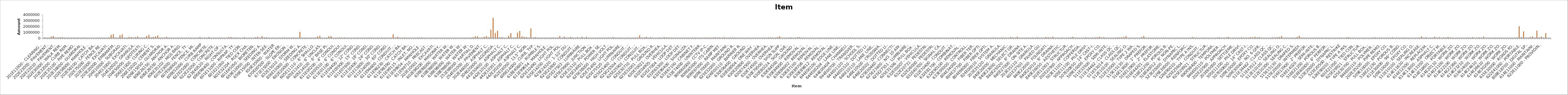
| Category | Series 0 | Series 1 |
|---|---|---|
| 201E11000 - CLEARING AND GRUBBING | 0 | 50000 |
| 202E20010 - HEADWALL REMOVED | 0 | 418.27 |
| 202E20010 - HEADWALL REMOVED | 0 | 836.54 |
| 202E23000 - PAVEMENT REMOVED | 0 | 198575.1 |
| 202E23000 - PAVEMENT REMOVED | 0 | 269966.1 |
| 202E23010 - PAVEMENT REMOVED, ASPHALT | 0 | 33501.96 |
| 202E23010 - PAVEMENT REMOVED, ASPHALT | 0 | 35130.6 |
| 202E23500 - WEARING COURSE REMOVED | 0 | 71818.75 |
| 202E23500 - WEARING COURSE REMOVED | 0 | 87736.25 |
| 202E30000 - WALK REMOVED | 0 | 20406.6 |
| 202E30700 - CONCRETE BARRIER REMOVED | 0 | 3377.84 |
| 202E30700 - CONCRETE BARRIER REMOVED | 0 | 6952.45 |
| 202E32000 - CURB REMOVED | 0 | 11618.63 |
| 202E32500 - CURB AND GUTTER REMOVED | 0 | 9683.64 |
| 202E35100 - PIPE REMOVED, 24" AND UNDER | 0 | 5894.59 |
| 202E35100 - PIPE REMOVED, 24" AND UNDER | 0 | 19631.56 |
| 202E35200 - PIPE REMOVED, OVER 24" | 0 | 788.62 |
| 202E35200 - PIPE REMOVED, OVER 24" | 0 | 998.92 |
| 202E38000 - GUARDRAIL REMOVED | 0 | 6898.7 |
| 202E38000 - GUARDRAIL REMOVED | 0 | 8944.16 |
| 202E53100 - MAILBOX REMOVED | 0 | 196.03 |
| 202E58000 - MANHOLE REMOVED | 0 | 760.56 |
| 202E58000 - MANHOLE REMOVED | 0 | 1521.11 |
| 202E58100 - CATCH BASIN REMOVED | 0 | 796.63 |
| 202E58100 - CATCH BASIN REMOVED | 0 | 10754.46 |
| 202E58500 - CATCH BASIN ABANDONED | 0 | 1233.85 |
| 202E70000 - FILL AND PLUG EXISTING CONDUIT | 0 | 9583.86 |
| 202E75000 - FENCE REMOVED | 0 | 1722.51 |
| 202E75000 - FENCE REMOVED | 0 | 5688.13 |
| 203E10000 - EXCAVATION | 0 | 41220.07 |
| 203E10000 - EXCAVATION | 0 | 469265.36 |
| 203E10000 - EXCAVATION | 0 | 586963.02 |
| 203E10001 - EXCAVATION, AS PER PLAN | 0 | 24300 |
| 203E20000 - EMBANKMENT | 0 | 1723.3 |
| 203E20000 - EMBANKMENT | 0 | 406497.27 |
| 203E20000 - EMBANKMENT | 0 | 571971.26 |
| 204E10000 - SUBGRADE COMPACTION | 0 | 894.33 |
| 204E10000 - SUBGRADE COMPACTION | 0 | 11414.47 |
| 204E13000 - EXCAVATION OF SUBGRADE | 0 | 104940 |
| 204E13000 - EXCAVATION OF SUBGRADE | 0 | 110040 |
| 204E20001 - EMBANKMENT, AS PER PLAN | 0 | 40210 |
| 204E20001 - EMBANKMENT, AS PER PLAN | 0 | 98450 |
| 204E30020 - GRANULAR MATERIAL, TYPE C | 0 | 193722.2 |
| 204E45000 - PROOF ROLLING | 0 | 7820 |
| 204E45000 - PROOF ROLLING | 0 | 9660 |
| 204E50000 - GEOTEXTILE FABRIC | 0 | 29898 |
| 206E10500 - CEMENT | 0 | 283761.32 |
| 206E10500 - CEMENT | 0 | 463843.11 |
| 206E11000 - CURING COAT | 0 | 73481.98 |
| 206E11000 - CURING COAT | 0 | 120139.74 |
| 206E15020 - CEMENT STABILIZED SUBGRADE, 14 INCHES DEEP | 0 | 225295.6 |
| 206E15020 - CEMENT STABILIZED SUBGRADE, 14 INCHES DEEP | 0 | 369698.02 |
| 206E30000 - MIXTURE DESIGN FOR CHEMICALLY STABILIZED SOILS | 0 | 15000 |
| 206E30000 - MIXTURE DESIGN FOR CHEMICALLY STABILIZED SOILS | 0 | 15000 |
| 606E15050 - GUARDRAIL, TYPE MGS | 0 | 41192.62 |
| 606E15050 - GUARDRAIL, TYPE MGS | 0 | 135898.87 |
| 606E26050 - ANCHOR ASSEMBLY, MGS TYPE B | 0 | 16466.83 |
| 606E26150 - ANCHOR ASSEMBLY, MGS TYPE E | 0 | 8508.33 |
| 606E26150 - ANCHOR ASSEMBLY, MGS TYPE E | 0 | 14889.58 |
| 606E26550 - ANCHOR ASSEMBLY, MGS TYPE T | 0 | 3362.62 |
| 606E26550 - ANCHOR ASSEMBLY, MGS TYPE T | 0 | 10087.85 |
| 606E35002 - MGS BRIDGE TERMINAL ASSEMBLY, TYPE 1 | 0 | 4238.91 |
| 606E35002 - MGS BRIDGE TERMINAL ASSEMBLY, TYPE 1 | 0 | 8477.82 |
| 606E35102 - MGS BRIDGE TERMINAL ASSEMBLY, TYPE 2 | 0 | 1362.58 |
| 606E60040 - IMPACT ATTENUATOR, TYPE 3 UNIDIRECTIONAL | 0 | 33295.15 |
| 607E23000 - FENCE, TYPE CLT | 0 | 8194.94 |
| 607E23000 - FENCE, TYPE CLT | 0 | 28455.16 |
| 607E70000 - FENCELINE SEEDING AND MULCHING | 0 | 292.86 |
| 607E70000 - FENCELINE SEEDING AND MULCHING | 0 | 1016.9 |
| 607E98000 - FENCE, MISC.: | 0 | 12000 |
| 608E10000 - 4" CONCRETE WALK | 0 | 95280.73 |
| 608E15000 - 8" CONCRETE WALK | 0 | 3407.34 |
| 608E52000 - CURB RAMP | 0 | 15642.48 |
| 622E10140 - CONCRETE BARRIER, SINGLE SLOPE, TYPE C1 | 0 | 8672.05 |
| 622E10160 - CONCRETE BARRIER, SINGLE SLOPE, TYPE D | 0 | 102176.91 |
| 622E25000 - CONCRETE BARRIER END SECTION, TYPE D | 0 | 2762.52 |
| 622E25001 - CONCRETE BARRIER END SECTION, TYPE D, AS PER PLAN | 0 | 12600 |
| 622E25014 - CONCRETE BARRIER, END ANCHORAGE, REINFORCED, TYPE C1 | 0 | 6339.98 |
| 622E25050 - CONCRETE BARRIER, END ANCHORAGE, REINFORCED, TYPE D | 0 | 12815.04 |
| 622E25051 - CONCRETE BARRIER, END ANCHORAGE, REINFORCED, TYPE D, AS PER PLAN | 0 | 19500 |
| 623E38500 - MONUMENT ASSEMBLY | 0 | 3377.37 |
| 623E40520 - RIGHT-OF-WAY MONUMENT | 0 | 1347.86 |
| 690E98000 - BOLLARD REMOVED AND RESET | 0 | 900 |
| 690E98400 - CONSULTANT FOR CONCRETE QUALITY CONTROL INCLUDING TESTING AND INSPECTION | 0 | 100000 |
| 690E98400 - CONSULTANT FOR CONCRETE QUALITY CONTROL INCLUDING TESTING AND INSPECTION | 0 | 100000 |
| 878E25000 - INSPECTION AND COMPACTION TESTING OF UNBOUND MATERIALS | 0 | 25000 |
| 878E25000 - INSPECTION AND COMPACTION TESTING OF UNBOUND MATERIALS | 0 | 25000 |
| 601E11000 - RIPRAP, TYPE D | 0 | 1289.12 |
| 601E21050 - TIED CONCRETE BLOCK MAT, TYPE 1 | 0 | 1280.84 |
| 601E21050 - TIED CONCRETE BLOCK MAT, TYPE 1 | 0 | 1793.18 |
| 601E21050 - TIED CONCRETE BLOCK MAT, TYPE 1 | 0 | 84535.73 |
| 601E32004 - ROCK CHANNEL PROTECTION, TYPE A WITH GEOTEXTILE FABRIC | 0 | 569.63 |
| 601E32104 - ROCK CHANNEL PROTECTION, TYPE B WITH GEOTEXTILE FABRIC | 0 | 2831.64 |
| 601E32204 - ROCK CHANNEL PROTECTION, TYPE C WITH GEOTEXTILE FABRIC | 0 | 336.71 |
| 601E32204 - ROCK CHANNEL PROTECTION, TYPE C WITH GEOTEXTILE FABRIC | 0 | 3367.07 |
| 601E39000 - PAVED GUTTER, TYPE 4 | 0 | 73170 |
| 601E45050 - BIORETENTION CELL | 0 | 124852 |
| 659E00100 - SOIL ANALYSIS TEST | 0 | 580 |
| 659E00300 - TOPSOIL | 0 | 255510 |
| 659E10000 - SEEDING AND MULCHING | 0 | 48468.75 |
| 659E10000 - SEEDING AND MULCHING | 0 | 72776 |
| 659E14000 - REPAIR SEEDING AND MULCHING | 0 | 6613.8 |
| 659E15000 - INTER-SEEDING | 0 | 2865.98 |
| 659E20000 - COMMERCIAL FERTILIZER | 0 | 14140.4 |
| 659E31000 - LIME | 0 | 2277.5 |
| 659E35000 - WATER | 0 | 1953.6 |
| 659E40000 - MOWING | 0 | 998.02 |
| 659E98000 - SEEDING, MISC.: | 0 | 20100 |
| 670E00500 - SLOPE EROSION PROTECTION | 0 | 47691.98 |
| 670E00700 - DITCH EROSION PROTECTION | 0 | 1707.4 |
| 670E00700 - DITCH EROSION PROTECTION | 0 | 6049.53 |
| 671E15000 - EROSION CONTROL MAT, TYPE A | 0 | 16732.25 |
| 832E15000 - STORM WATER POLLUTION PREVENTION PLAN | 0 | 50000 |
| 832E15002 - STORM WATER POLLUTION PREVENTION INSPECTIONS | 0 | 17000 |
| 832E15010 - STORM WATER POLLUTION PREVENTION INSPECTION SOFTWARE | 0 | 9800 |
| 832E30000 - EROSION CONTROL | 0 | 991071 |
| 836E10000 - SEEDING AND EROSION CONTROL WITH TURF REINFORCING MAT, TYPE 1 | 0 | 1363.43 |
| 836E10000 - SEEDING AND EROSION CONTROL WITH TURF REINFORCING MAT, TYPE 1 | 0 | 7670.21 |
| 836E10020 - SEEDING AND EROSION CONTROL WITH TURF REINFORCING MAT, TYPE 2 | 0 | 761.81 |
| 836E10020 - SEEDING AND EROSION CONTROL WITH TURF REINFORCING MAT, TYPE 2 | 0 | 1744.54 |
| 602E20000 - CONCRETE MASONRY | 0 | 1361.78 |
| 602E20000 - CONCRETE MASONRY | 0 | 8585.16 |
| 602E98200 - MASONRY, MISC.: | 0 | 11520 |
| 605E11110 - 6" SHALLOW PIPE UNDERDRAINS WITH GEOTEXTILE FABRIC | 0 | 218770.79 |
| 605E11110 - 6" SHALLOW PIPE UNDERDRAINS WITH GEOTEXTILE FABRIC | 0 | 320993.34 |
| 605E13300 - 6" UNCLASSIFIED PIPE UNDERDRAINS | 0 | 1411.91 |
| 605E13410 - 6" UNCLASSIFIED PIPE UNDERDRAINS WITH GEOTEXTILE FABRIC | 0 | 575.73 |
| 605E13410 - 6" UNCLASSIFIED PIPE UNDERDRAINS WITH GEOTEXTILE FABRIC | 0 | 4514.23 |
| 605E14020 - 6" BASE PIPE UNDERDRAINS WITH GEOTEXTILE FABRIC | 0 | 230260.13 |
| 605E14020 - 6" BASE PIPE UNDERDRAINS WITH GEOTEXTILE FABRIC | 0 | 269134.09 |
| 611E00100 - 4" CONDUIT, TYPE B | 0 | 1819.98 |
| 611E00200 - 4" CONDUIT, TYPE C | 0 | 1850 |
| 611E00200 - 4" CONDUIT, TYPE C | 0 | 11599.5 |
| 611E00200 - 4" CONDUIT, TYPE C | 0 | 50116.5 |
| 611E00510 - 6" CONDUIT, TYPE F FOR UNDERDRAIN OUTLETS | 0 | 26657 |
| 611E00510 - 6" CONDUIT, TYPE F FOR UNDERDRAIN OUTLETS | 0 | 48348.78 |
| 611E00900 - 6" CONDUIT, TYPE B | 0 | 425.46 |
| 611E00900 - 6" CONDUIT, TYPE B | 0 | 2080.01 |
| 611E01100 - 6" CONDUIT, TYPE C | 0 | 1930.24 |
| 611E01500 - 6" CONDUIT, TYPE F | 0 | 2137.4 |
| 611E04400 - 12" CONDUIT, TYPE B | 0 | 4117.87 |
| 611E04400 - 12" CONDUIT, TYPE B | 0 | 27270.42 |
| 611E04600 - 12" CONDUIT, TYPE C | 0 | 1534.48 |
| 611E05900 - 15" CONDUIT, TYPE B | 0 | 7409.91 |
| 611E05900 - 15" CONDUIT, TYPE B | 0 | 9864.46 |
| 611E07400 - 18" CONDUIT, TYPE B | 0 | 9611.81 |
| 611E07400 - 18" CONDUIT, TYPE B | 0 | 28617.66 |
| 611E07600 - 18" CONDUIT, TYPE C | 0 | 29315.43 |
| 611E08900 - 21" CONDUIT, TYPE B | 0 | 2393.61 |
| 611E10400 - 24" CONDUIT, TYPE B | 0 | 8345.94 |
| 611E10400 - 24" CONDUIT, TYPE B | 0 | 11291.63 |
| 611E12100 - 27" CONDUIT, TYPE C | 0 | 1714.72 |
| 611E13400 - 30" CONDUIT, TYPE B | 0 | 7181 |
| 611E13600 - 30" CONDUIT, TYPE C | 0 | 1476.21 |
| 611E13600 - 30" CONDUIT, TYPE C | 0 | 5461.96 |
| 611E16600 - 36" CONDUIT, TYPE C  | 0 | 3044.08 |
| 611E24000 - 60" CONDUIT, TYPE C | 0 | 8500 |
| 611E26400 - 72" CONDUIT, TYPE C | 0 | 573600 |
| 611E96600 - CONDUIT, BORED OR JACKED | 0 | 27500 |
| 611E96600 - CONDUIT, BORED OR JACKED | 0 | 154000 |
| 611E98150 - CATCH BASIN, NO. 3 | 0 | 21060.32 |
| 611E98180 - CATCH BASIN, NO. 3A | 0 | 12963.68 |
| 611E98230 - CATCH BASIN, NO. 4 | 0 | 33592.58 |
| 611E98300 - CATCH BASIN, NO. 5 | 0 | 7111.67 |
| 611E98341 - CATCH BASIN, NO. 5A | 0 | 6140 |
| 611E98390 - CATCH BASIN, NO. 7 | 0 | 3434.75 |
| 611E98410 - CATCH BASIN, NO. 8 | 0 | 3333.73 |
| 611E99114 - INLET, NO. 3 FOR SINGLE SLOPE BARRIER, TYPE D | 0 | 8427.96 |
| 611E99115 - INLET, NO. 3 FOR SINGLE SLOPE BARRIER, TYPE D, AS PER PLAN | 0 | 18220 |
| 611E99115 - INLET, NO. 3 FOR SINGLE SLOPE BARRIER, TYPE D, AS PER PLAN | 0 | 18220 |
| 611E99574 - MANHOLE, NO. 3 | 0 | 32000 |
| 611E99654 - MANHOLE ADJUSTED TO GRADE | 0 | 1400.84 |
| 611E99654 - MANHOLE ADJUSTED TO GRADE | 0 | 4202.52 |
| 611E99710 - PRECAST REINFORCED CONCRETE OUTLET | 0 | 2674.47 |
| 611E99710 - PRECAST REINFORCED CONCRETE OUTLET | 0 | 3744.25 |
| 611E99820 - MISCELLANEOUS METAL | 0 | 1207.52 |
| 203E10001 - EXCAVATION, AS PER PLAN | 0 | 300 |
| 203E10001 - EXCAVATION, AS PER PLAN | 0 | 375 |
| 509E25000 - UNCOATED REINFORCING STEEL | 0 | 236.02 |
| 602E98200 - MASONRY, MISC.: | 0 | 140 |
| 602E98200 - MASONRY, MISC.: | 0 | 210 |
| 638E11500 - SHEETING AND BRACING ORDERED LEFT IN PLACE | 0 | 300 |
| 638E98000 - WATER WORK, MISC.: | 0 | 125 |
| 638E98000 - WATER WORK, MISC.: | 0 | 300 |
| 638E98000 - WATER WORK, MISC.: | 0 | 200 |
| 638E98000 - WATER WORK, MISC.: | 0 | 500 |
| 638E98000 - WATER WORK, MISC.: | 0 | 1000 |
| 638E98000 - WATER WORK, MISC.: | 0 | 1000 |
| 638E98000 - WATER WORK, MISC.: | 0 | 3100 |
| 638E98000 - WATER WORK, MISC.: | 0 | 270 |
| 638E98000 - WATER WORK, MISC.: | 0 | 2000 |
| 638E98600 - WATER WORK, MISC.: | 0 | 6000 |
| 638E98600 - WATER WORK, MISC.: | 0 | 20500 |
| 251E98000 - PARTIAL DEPTH REPAIR, MISC.: | 0 | 90000 |
| 251E98000 - PARTIAL DEPTH REPAIR, MISC.: | 0 | 230000 |
| 251E98000 - PARTIAL DEPTH REPAIR, MISC.: | 0 | 230000 |
| 254E01000 - PAVEMENT PLANING, ASPHALT CONCRETE | 0 | 6608.91 |
| 254E01000 - PAVEMENT PLANING, ASPHALT CONCRETE | 0 | 17645.39 |
| 254E01000 - PAVEMENT PLANING, ASPHALT CONCRETE | 0 | 145702.89 |
| 301E46000 - ASPHALT CONCRETE BASE, PG64-22 | 0 | 258939.23 |
| 301E46001 - ASPHALT CONCRETE BASE, PG64-22, AS PER PLAN | 0 | 80040 |
| 302E46000 - ASPHALT CONCRETE BASE, PG64-22 | 0 | 1378355 |
| 302E46000 - ASPHALT CONCRETE BASE, PG64-22 | 0 | 3374685 |
| 304E20000 - AGGREGATE BASE | 0 | 818415 |
| 304E20000 - AGGREGATE BASE | 0 | 1191780 |
| 407E20000 - NON-TRACKING TACK COAT | 0 | 61405.4 |
| 407E20000 - NON-TRACKING TACK COAT | 0 | 68949.05 |
| 441E50400 - ASPHALT CONCRETE SURFACE COURSE, TYPE 1, (448), (DRIVEWAYS) | 0 | 860 |
| 441E50600 - ASPHALT CONCRETE INTERMEDIATE COURSE, TYPE 2, (448), (DRIVEWAYS) | 0 | 1229.34 |
| 442E10100 - ASPHALT CONCRETE INTERMEDIATE COURSE, 19 MM, TYPE A (446) | 0 | 323051.68 |
| 442E10100 - ASPHALT CONCRETE INTERMEDIATE COURSE, 19 MM, TYPE A (446) | 0 | 791144.19 |
| 442E10101 - ASPHALT CONCRETE INTERMEDIATE COURSE, 19 MM, TYPE A (446), A S PER PLAN | 0 | 18000 |
| 442E10101 - ASPHALT CONCRETE INTERMEDIATE COURSE, 19 MM, TYPE A (446), A S PER PLAN | 0 | 44250 |
| 442E10301 - ASPHALT CONCRETE SURFACE COURSE, 12.5 MM, TYPE A (447), AS PER PLAN | 0 | 868700 |
| 442E10301 - ASPHALT CONCRETE SURFACE COURSE, 12.5 MM, TYPE A (447), AS PER PLAN | 0 | 1136800 |
| 442E20000 - ASPHALT CONCRETE SURFACE COURSE, 12.5 MM, TYPE A (448) | 0 | 213124.49 |
| 442E20200 - ASPHALT CONCRETE INTERMEDIATE COURSE, 19 MM, TYPE A (448) | 0 | 149872.7 |
| 442E20201 - ASPHALT CONCRETE INTERMEDIATE COURSE, 19 MM, TYPE A (448), AS PER PLAN | 0 | 101384 |
| 452E10010 - 6" NON-REINFORCED CONCRETE PAVEMENT, CLASS QC 1P | 0 | 4914.27 |
| 452E16050 - 13.5" NON-REINFORCED CONCRETE PAVEMENT, CLASS QC 1P | 0 | 1581580 |
| 609E12000 - COMBINATION CURB AND GUTTER, TYPE 2 | 0 | 20266.6 |
| 609E12001 - COMBINATION CURB AND GUTTER, TYPE 2, AS PER PLAN | 0 | 81800 |
| 609E14000 - CURB, TYPE 2-A | 0 | 6499.88 |
| 609E24510 - CURB, TYPE 4-C | 0 | 1538.72 |
| 609E24510 - CURB, TYPE 4-C | 0 | 1538.72 |
| 618E40601 - RUMBLE STRIPS, (ASPHALT CONCRETE), AS PER PLAN | 0 | 13100 |
| 618E40601 - RUMBLE STRIPS, (ASPHALT CONCRETE), AS PER PLAN | 0 | 5360 |
| 611E97910 - SANITARY SEWER | 0 | 3200 |
| 611E99654 - MANHOLE ADJUSTED TO GRADE | 0 | 6303.78 |
| 625E00450 - CONNECTION, FUSED PULL APART | 0 | 22780 |
| 625E00480 - CONNECTION, UNFUSED PERMANENT | 0 | 4465.13 |
| 625E10490 - LIGHT POLE, CONVENTIONAL | 0 | 7760.22 |
| 625E10494 - LIGHT POLE, LOW MAST | 0 | 261050 |
| 625E10495 - LIGHT POLE, LOW MAST, AS PER PLAN | 0 | 3000 |
| 625E14200 - LIGHT POLE FOUNDATION, 24" X 10' DEEP | 0 | 179688.01 |
| 625E23200 - NO. 4 AWG 2400 VOLT DISTRIBUTION CABLE | 0 | 25060.15 |
| 625E23400 - NO. 10 AWG POLE AND BRACKET CABLE | 0 | 19922.45 |
| 625E24320 - 1-1/2" DUCT CABLE WITH THREE NO. 4 AWG 2400 VOLT CABLES | 0 | 139022.09 |
| 625E25400 - CONDUIT, 2", 725.04 | 0 | 18799.83 |
| 625E25500 - CONDUIT, 3", 725.04 | 0 | 2420.4 |
| 625E25900 - CONDUIT, JACKED OR DRILLED | 0 | 57359 |
| 625E26253 - LUMINAIRE, CONVENTIONAL, SOLID STATE (LED), AS PER PLAN | 0 | 1400 |
| 625E26273 - LUMINAIRE, LOW MAST, SOLID STATE (LED), AS PER PLAN | 0 | 150930 |
| 625E27503 - LUMINAIRE, UNDERPASS, SOLID STATE (LED), AS PER PLAN | 0 | 6720 |
| 625E29000 - TRENCH | 0 | 127118.13 |
| 625E29500 - TRENCH IN PAVED AREA, TYPE A | 0 | 16344.64 |
| 625E29900 - JUNCTION BOX | 0 | 4367.06 |
| 625E30510 - PULL BOX, 725.06, SIZE 4 | 0 | 3000 |
| 625E30700 - PULL BOX, 725.08, 18" | 0 | 13430 |
| 625E31510 - PULL BOX REMOVED | 0 | 5100 |
| 625E32000 - GROUND ROD | 0 | 25691.68 |
| 625E33000 - STRUCTURE GROUNDING SYSTEM | 0 | 7922.15 |
| 625E34001 - POWER SERVICE, AS PER PLAN | 0 | 14050 |
| 625E36000 - PLASTIC CAUTION TAPE | 0 | 3372.24 |
| 625E37100 - SERVICE TO UNDERPASS LIGHTING | 0 | 31160 |
| 625E38000 - HIGH VOLTAGE TEST | 0 | 3700 |
| 625E40000 - MAINTAIN EXISTING LIGHTING | 0 | 100000 |
| 625E75350 - LIGHT TOWER REMOVED | 0 | 17359.88 |
| 625E75400 - LIGHT POLE REMOVED | 0 | 12628.71 |
| 625E75500 - LIGHT POLE FOUNDATION REMOVED | 0 | 13830.36 |
| 625E75510 - POWER SERVICE REMOVED | 0 | 553.81 |
| 625E75520 - LUMINAIRE SUPPORT REMOVED | 0 | 1364.43 |
| 625E75540 - LIGHT TOWER FOUNDATION REMOVED | 0 | 6579.27 |
| 625E75801 - DISCONNECT CIRCUIT, AS PER PLAN | 0 | 15000 |
| 625E25400 - CONDUIT, 2", 725.04 | 0 | 3869.89 |
| 625E25408 - CONDUIT, 2", 725.051 | 0 | 3546.94 |
| 625E25500 - CONDUIT, 3", 725.04 | 0 | 18079.88 |
| 625E25504 - CONDUIT, 3", 725.051 | 0 | 8006.83 |
| 625E25750 - CONDUIT, 4", MULTICELL, 725.20 , EPC-40 | 0 | 395922 |
| 625E25752 - CONDUIT, 4", MULTICELL, 725.20 , EPC-80 | 0 | 27554 |
| 625E25901 - CONDUIT, JACKED OR DRILLED, AS PER PLAN | 0 | 53640 |
| 625E29010 - TRENCH, 30" DEEP | 0 | 135670.5 |
| 625E30700 - PULL BOX, 725.08, 18" | 0 | 7699.9 |
| 625E30710 - PULL BOX, 725.08, 32" | 0 | 65341.47 |
| 625E31510 - PULL BOX REMOVED | 0 | 1088.95 |
| 625E32000 - GROUND ROD | 0 | 1213.78 |
| 625E32001 - GROUND ROD, AS PER PLAN | 0 | 1075 |
| 625E34001 - POWER SERVICE, AS PER PLAN | 0 | 42150 |
| 625E36000 - PLASTIC CAUTION TAPE | 0 | 1986.6 |
| 630E70021 - OVERHEAD SIGN SUPPORT, DMS TRUSS, 115', AS PER PLAN | 0 | 90000 |
| 630E70051 - CATWALK, DMS TRUSS, AS PER PLAN | 0 | 50000 |
| 630E70080 - OVERHEAD SIGN SUPPORT FOUNDATION, DMS TRUSS | 0 | 40000 |
| 632E04905 - VEHICULAR SIGNAL HEAD, (LED), 2-SECTION, 12" LENS, 1-WAY, POLYCARBONATE, AS PER PLAN | 0 | 5200 |
| 632E25000 - COVERING OF VEHICULAR SIGNAL HEAD | 0 | 218.9 |
| 632E26500 - DETECTOR LOOP | 0 | 10816.89 |
| 632E27004 - LOOP DETECTOR UNIT | 0 | 1536 |
| 632E40500 - SIGNAL CABLE, 5 CONDUCTOR, NO. 14 AWG | 0 | 4143.8 |
| 632E64010 - SIGNAL SUPPORT FOUNDATION | 0 | 6894.84 |
| 632E65300 - LOOP DETECTOR LEAD-IN CABLE, 2 CONDUCTOR, NO. 14 AWG | 0 | 4351.78 |
| 632E68200 - POWER CABLE, 2 CONDUCTOR, NO. 6 AWG | 0 | 8513.1 |
| 632E90300 - SIGNALIZATION, MISC.: | 0 | 5000 |
| 632E90400 - SIGNALIZATION, MISC.: | 0 | 1500 |
| 632E90400 - SIGNALIZATION, MISC.: | 0 | 16000 |
| 632E90400 - SIGNALIZATION, MISC.: | 0 | 20000 |
| 633E67100 - CABINET FOUNDATION | 0 | 6353.13 |
| 633E67200 - CONTROLLER WORK PAD | 0 | 792.5 |
| 633E67201 - CONTROLLER WORK PAD, AS PER PLAN | 0 | 3300 |
| 633E74000 - UNINTERRUPTIBLE POWER SUPPLY (UPS) | 0 | 20800 |
| 804E15010 - FIBER OPTIC CABLE, 24 FIBER | 0 | 40074 |
| 804E34022 - FIBER TERMINATION PANEL, 24 FIBER | 0 | 13869.72 |
| 809E60000 - CCTV IP-CAMERA SYSTEM, DOME-TYPE | 0 | 11126.28 |
| 809E61000 - CCTV CONCRETE POLE WITH LOWERING UNIT, 70 FEET | 0 | 31301.47 |
| 809E63000 - DYNAMIC MESSAGE SIGN (DMS), FULL-SIZE WALK-IN | 0 | 72000 |
| 809E65000 - ITS CABINET - GROUND MOUNTED | 0 | 15470.33 |
| 809E65030 - ITS CABINET - RAMP METER | 0 | 32200 |
| 809E65990 - ITS DEVICE, MISC.: | 0 | 6000 |
| 809E67000 - RAMP METER SYSTEM | 0 | 70000 |
| 809E68900 - SIDE-FIRED RADAR DETECTOR | 0 | 15300 |
| 809E69123 - ATC V6.24 CONTROLLER, AS PER PLAN | 0 | 29360 |
| 809E70000 - MAINTAINING ITS DURING CONSTRUCTION | 0 | 34000 |
| 621E00100 - RPM | 0 | 30204.36 |
| 621E54000 - RAISED PAVEMENT MARKER REMOVED | 0 | 8099.79 |
| 625E32000 - GROUND ROD | 0 | 6068.88 |
| 626E00102 - BARRIER REFLECTOR, TYPE 1 | 0 | 78.52 |
| 626E00102 - BARRIER REFLECTOR, TYPE 1 | 0 | 274.83 |
| 626E00110 - BARRIER REFLECTOR, TYPE 2 | 0 | 188.67 |
| 626E00110 - BARRIER REFLECTOR, TYPE 2 | 0 | 971.3 |
| 630E03100 - GROUND MOUNTED SUPPORT, NO. 3 POST | 0 | 10467.03 |
| 630E06400 - GROUND MOUNTED STRUCTURAL BEAM SUPPORT, S4X7.7 | 0 | 1258.23 |
| 630E07500 - GROUND MOUNTED STRUCTURAL BEAM SUPPORT, W10X22 | 0 | 10238.45 |
| 630E07600 - GROUND MOUNTED STRUCTURAL BEAM SUPPORT, W10X12 | 0 | 2930.07 |
| 630E08004 - ONE WAY SUPPORT, NO. 3 POST | 0 | 1274.73 |
| 630E08600 - SIGN POST REFLECTOR | 0 | 826.95 |
| 630E09000 - BREAKAWAY STRUCTURAL BEAM CONNECTION | 0 | 4707.29 |
| 630E20800 - OVERHEAD SIGN SUPPORT, TYPE TC-12.30, DESIGN 8 | 0 | 28965.44 |
| 630E74500 - OVERHEAD SIGN SUPPORT, MISC.: | 0 | 12600 |
| 630E74500 - OVERHEAD SIGN SUPPORT, MISC.: | 0 | 45000 |
| 630E74500 - OVERHEAD SIGN SUPPORT, MISC.: | 0 | 19000 |
| 630E74500 - OVERHEAD SIGN SUPPORT, MISC.: | 0 | 24000 |
| 630E74500 - OVERHEAD SIGN SUPPORT, MISC.: | 0 | 24400 |
| 630E74500 - OVERHEAD SIGN SUPPORT, MISC.: | 0 | 90000 |
| 630E74500 - OVERHEAD SIGN SUPPORT, MISC.: | 0 | 252000 |
| 630E79100 - SIGN HANGER ASSEMBLY, MAST ARM | 0 | 3095.65 |
| 630E79500 - SIGN SUPPORT ASSEMBLY, POLE MOUNTED | 0 | 231.9 |
| 630E80100 - SIGN, FLAT SHEET | 0 | 15420.47 |
| 630E80200 - SIGN, GROUND MOUNTED EXTRUSHEET | 0 | 10173.55 |
| 630E80224 - SIGN, OVERHEAD EXTRUSHEET | 0 | 57321.11 |
| 630E81020 - CONCRETE MEDIAN BARRIER SIGN BRACKET | 0 | 530 |
| 630E84010 - CONCRETE BARRIER MEDIAN OVERHEAD SIGN SUPPORT FOUNDATION, TY PE TC-21.50 | 0 | 9669.55 |
| 630E84500 - GROUND MOUNTED STRUCTURAL BEAM SUPPORT FOUNDATION | 0 | 78400 |
| 630E84510 - RIGID OVERHEAD SIGN SUPPORT FOUNDATION | 0 | 83975.04 |
| 630E84520 - SPAN WIRE SIGN SUPPORT FOUNDATION | 0 | 22800 |
| 630E84900 - REMOVAL OF GROUND MOUNTED SIGN AND DISPOSAL | 0 | 1806.71 |
| 630E85400 - REMOVAL OF GROUND MOUNTED MAJOR SIGN AND DISPOSAL | 0 | 808.88 |
| 630E85600 - REMOVAL OF GROUND MOUNTED MAJOR SIGN AND REERECTION | 0 | 1876.24 |
| 630E86002 - REMOVAL OF GROUND MOUNTED POST SUPPORT AND DISPOSAL | 0 | 2071.57 |
| 630E86102 - REMOVAL OF GROUND MOUNTED STRUCTURAL BEAM SUPPORT AND DISPOSAL | 0 | 10535 |
| 630E86310 - REMOVAL OF STRUCTURE MOUNTED SIGN AND DISPOSAL | 0 | 405.54 |
| 630E87100 - REMOVAL OF OVERHEAD MOUNTED SIGN AND REERECTION | 0 | 372.56 |
| 630E87400 - REMOVAL OF OVERHEAD MOUNTED SIGN AND DISPOSAL | 0 | 7806.95 |
| 630E87500 - REMOVAL OF POLE MOUNTED SIGN AND DISPOSAL | 0 | 101.52 |
| 630E89706 - REMOVAL OF OVERHEAD SIGN SUPPORT AND DISPOSAL, TYPE TC-12.30 | 0 | 5443.97 |
| 630E89802 - REMOVAL OF OVERHEAD SIGN SUPPORT AND DISPOSAL, TYPE TC-7.65 | 0 | 9954.68 |
| 630E89810 - REMOVAL OF OVERHEAD SIGN SUPPORT AND DISPOSAL, TYPE TC-17.10 | 0 | 6400 |
| 630E89812 - REMOVAL OF WOOD POLE AND DISPOSAL | 0 | 442 |
| 631E94406 - REMOVAL OF SIGNS WIRED | 0 | 66.97 |
| 631E97700 - SIGN LIGHTING MISC.: | 0 | 2400 |
| 644E00100 - EDGE LINE, 4" | 0 | 255.29 |
| 644E00104 - EDGE LINE, 6" | 0 | 33121.81 |
| 644E00200 - LANE LINE, 4" | 0 | 748.75 |
| 644E00204 - LANE LINE, 6" | 0 | 19741.68 |
| 644E00300 - CENTER LINE | 0 | 3762.93 |
| 644E00400 - CHANNELIZING LINE, 8" | 0 | 6517.48 |
| 644E00404 - CHANNELIZING LINE, 12" | 0 | 22269.75 |
| 644E00500 - STOP LINE | 0 | 1909.28 |
| 644E00600 - CROSSWALK LINE | 0 | 1740.39 |
| 644E00700 - TRANSVERSE/DIAGONAL LINE | 0 | 3300.09 |
| 644E00720 - CHEVRON MARKING | 0 | 4095.81 |
| 644E00900 - ISLAND MARKING | 0 | 1478.95 |
| 644E01120 - SCHOOL SYMBOL MARKING, 120" | 0 | 1304.21 |
| 644E01300 - LANE ARROW | 0 | 5758.11 |
| 644E01500 - DOTTED LINE, 4" | 0 | 709.77 |
| 644E01510 - DOTTED LINE, 6" | 0 | 8472.85 |
| 644E30030 - REMOVAL OF PAVEMENT MARKING | 0 | 13358.84 |
| 646E10010 - EDGE LINE, 6" | 0 | 14926.53 |
| 646E10110 - LANE LINE, 6" | 0 | 3885.67 |
| 646E10310 - CHANNELIZING LINE, 12" | 0 | 4741.51 |
| 646E10400 - STOP LINE | 0 | 1853.31 |
| 646E10500 - CROSSWALK LINE | 0 | 1575.18 |
| 646E20300 - LANE ARROW | 0 | 5271.61 |
| 646E20320 - WRONG WAY ARROW | 0 | 1311.81 |
| 646E20502 - DOTTED LINE, 4" | 0 | 639.49 |
| 611E00400 - 4" CONDUIT, TYPE E | 0 | 641.31 |
| 625E00450 - CONNECTION, FUSED PULL APART | 0 | 172.01 |
| 625E00460 - CONNECTION, UNFUSED PULL APART | 0 | 138.54 |
| 625E18401 - BRACKET ARM, 20', AS PER PLAN | 0 | 2100 |
| 625E23304 - NO. 8 AWG 600 VOLT DISTRIBUTION CABLE | 0 | 1086 |
| 625E23400 - NO. 10 AWG POLE AND BRACKET CABLE | 0 | 455.49 |
| 625E25400 - CONDUIT, 2", 725.04 | 0 | 3051.05 |
| 625E25600 - CONDUIT, 4", 725.04 | 0 | 5798.98 |
| 625E27551 - LUMINAIRE, DECORATIVE, AS PER PLAN | 0 | 2800 |
| 625E29000 - TRENCH | 0 | 2655.89 |
| 625E30700 - PULL BOX, 725.08, 18" | 0 | 769.99 |
| 625E31506 - PULL BOX REMOVED AND REPLACED | 0 | 4200 |
| 625E32001 - GROUND ROD, AS PER PLAN | 0 | 1720 |
| 625E36000 - PLASTIC CAUTION TAPE | 0 | 41.75 |
| 632E05007 - VEHICULAR SIGNAL HEAD, (LED), 3-SECTION, 12" LENS, 1-WAY, POLYCARBONATE, AS PER PLAN | 0 | 3360 |
| 632E05007 - VEHICULAR SIGNAL HEAD, (LED), 3-SECTION, 12" LENS, 1-WAY, POLYCARBONATE, AS PER PLAN | 0 | 8400 |
| 632E05087 - VEHICULAR SIGNAL HEAD, (LED), 5-SECTION, 12" LENS, 1-WAY, POLYCARBONATE, AS PER PLAN | 0 | 2600 |
| 632E20731 - PEDESTRIAN SIGNAL HEAD (LED), TYPE D2, COUNTDOWN, AS PER PLAN | 0 | 2750 |
| 632E25000 - COVERING OF VEHICULAR SIGNAL HEAD | 0 | 437.79 |
| 632E25010 - COVERING OF PEDESTRIAN SIGNAL HEAD | 0 | 168.02 |
| 632E26000 - PEDESTRIAN PUSHBUTTON | 0 | 557.24 |
| 632E26501 - DETECTOR LOOP, AS PER PLAN | 0 | 3900 |
| 632E40500 - SIGNAL CABLE, 5 CONDUCTOR, NO. 14 AWG | 0 | 3117.72 |
| 632E40700 - SIGNAL CABLE, 7 CONDUCTOR, NO. 14 AWG | 0 | 3400.86 |
| 632E64010 - SIGNAL SUPPORT FOUNDATION | 0 | 10342.26 |
| 632E64020 - PEDESTAL FOUNDATION | 0 | 4176.06 |
| 632E70400 - CONDUIT RISER, 2" DIAMETER | 0 | 3902.5 |
| 632E80700 - SIGNAL SUPPORT, MISC.: | 0 | 11000 |
| 632E80700 - SIGNAL SUPPORT, MISC.: | 0 | 2250 |
| 632E81700 - COMBINATION SIGNAL SUPPORT, MISC.: | 0 | 50000 |
| 632E89900 - PEDESTAL, 8', TRANSFORMER BASE | 0 | 2194.23 |
| 632E89901 - PEDESTAL, 8', TRANSFORMER BASE, AS PER PLAN | 0 | 970 |
| 632E90100 - REMOVAL OF TRAFFIC SIGNAL INSTALLATION | 0 | 6235.64 |
| 632E90200 - REUSE OF VEHICULAR SIGNAL HEAD | 0 | 2598.82 |
| 632E90202 - REUSE OF PEDESTRIAN SIGNAL HEAD | 0 | 300 |
| 633E99300 - CONTROLLER ITEM, MISC.: | 0 | 1000 |
| 804E30000 - FAN-OUT KIT, 6 FIBER | 0 | 960 |
| 804E32020 - DROP CABLE, 6 FIBER | 0 | 1000 |
| 804E34000 - FIBER TERMINATION PANEL, 6 FIBER | 0 | 2680 |
| 804E36000 - SLACK INSTALLATION | 0 | 941.88 |
| 804E37001 - SPLICE ENCLOSURE, AS PER PLAN | 0 | 5200 |
| 804E37700 - FIBER OPTIC CABLE TESTING | 0 | 5000 |
| 804E38000 - FIBER OPTIC CABLE MODEM | 0 | 9200 |
| 804E98000 - FIBER OPTIC CABLE, MISC.: | 0 | 450 |
| 804E98000 - FIBER OPTIC CABLE, MISC.: | 0 | 7587 |
| 809E69100 - STOP LINE RADAR DETECTION | 0 | 35453.26 |
| 816E30001 - VIDEO DETECTION SYSTEM, AS PER PLAN | 0 | 30000 |
| 824E00010 - SYSTEM ANALYSIS | 0 | 10000 |
| 203E20000 - EMBANKMENT | 0 | 1867.43 |
| 203E35110 - GRANULAR MATERIAL, TYPE B | 0 | 54657.63 |
| 203E35120 - GRANULAR MATERIAL, TYPE C | 0 | 15798.84 |
| 512E10101 - SEALING OF CONCRETE SURFACES (EPOXY-URETHANE), AS PER PLAN | 0 | 8806 |
| 601E37501 - PAVED GUTTER, TYPE 1-2, AS PER PLAN | 0 | 8190 |
| 840E20000 - MECHANICALLY STABILIZED EARTH WALL | 0 | 110190.03 |
| 840E21000 - WALL EXCAVATION | 0 | 59567.14 |
| 840E22000 - FOUNDATION PREPARATION | 0 | 18435.56 |
| 840E23000 - SELECT GRANULAR BACKFILL | 0 | 151891.25 |
| 840E23050 - NATURAL SOIL | 0 | 2361.86 |
| 840E25010 - 6" DRAINAGE PIPE, PERFORATED | 0 | 11699.99 |
| 840E25020 - 6" DRAINAGE PIPE, NON-PERFORATED | 0 | 1420.17 |
| 840E26000 - CONCRETE COPING | 0 | 34215.71 |
| 840E26050 - AESTHETIC SURFACE TREATMENT | 0 | 7673.12 |
| 840E27000 - ON-SITE ASSISTANCE | 0 | 1803.26 |
| 867E00100 - TEMPORARY WIRE FACED MECHANICALLY STABILIZED EARTH WALL | 0 | 25000 |
| 203E20000 - EMBANKMENT | 0 | 2312.35 |
| 203E35110 - GRANULAR MATERIAL, TYPE B | 0 | 56417.34 |
| 203E35120 - GRANULAR MATERIAL, TYPE C | 0 | 15798.84 |
| 512E10101 - SEALING OF CONCRETE SURFACES (EPOXY-URETHANE), AS PER PLAN | 0 | 8976 |
| 601E37501 - PAVED GUTTER, TYPE 1-2, AS PER PLAN | 0 | 8120 |
| 840E20000 - MECHANICALLY STABILIZED EARTH WALL | 0 | 115715.34 |
| 840E21000 - WALL EXCAVATION | 0 | 62591.18 |
| 840E22000 - FOUNDATION PREPARATION | 0 | 19077.91 |
| 840E23000 - SELECT GRANULAR BACKFILL | 0 | 160436.13 |
| 840E23050 - NATURAL SOIL | 0 | 2653.45 |
| 840E25010 - 6" DRAINAGE PIPE, PERFORATED | 0 | 11579.53 |
| 840E25020 - 6" DRAINAGE PIPE, NON-PERFORATED | 0 | 1089.45 |
| 840E26000 - CONCRETE COPING | 0 | 34579.71 |
| 840E26050 - AESTHETIC SURFACE TREATMENT | 0 | 8057.88 |
| 840E27000 - ON-SITE ASSISTANCE | 0 | 1803.26 |
| 867E00100 - TEMPORARY WIRE FACED MECHANICALLY STABILIZED EARTH WALL | 0 | 25000 |
| 202E11003 - STRUCTURE REMOVED, OVER 20 FOOT SPAN, AS PER PLAN | 0 | 53747.15 |
| 202E11003 - STRUCTURE REMOVED, OVER 20 FOOT SPAN, AS PER PLAN | 0 | 131587.85 |
| 202E22900 - APPROACH SLAB REMOVED | 0 | 3408.58 |
| 202E22900 - APPROACH SLAB REMOVED | 0 | 8277.99 |
| 203E65000 - SETTLEMENT PLATFORM | 0 | 1319.2 |
| 203E65000 - SETTLEMENT PLATFORM | 0 | 3957.6 |
| 503E11101 - COFFERDAMS AND EXCAVATION BRACING, AS PER PLAN | 0 | 23200 |
| 503E11101 - COFFERDAMS AND EXCAVATION BRACING, AS PER PLAN | 0 | 56800 |
| 505E11100 - PILE DRIVING EQUIPMENT MOBILIZATION | 0 | 5800 |
| 505E11100 - PILE DRIVING EQUIPMENT MOBILIZATION | 0 | 14200 |
| 507E00600 - 14" CAST-IN-PLACE REINFORCED CONCRETE PILES, DRIVEN | 0 | 20078.25 |
| 507E00600 - 14" CAST-IN-PLACE REINFORCED CONCRETE PILES, DRIVEN | 0 | 49176.75 |
| 507E00650 - 14" CAST-IN-PLACE REINFORCED CONCRETE PILES, FURNISHED | 0 | 63588 |
| 507E00650 - 14" CAST-IN-PLACE REINFORCED CONCRETE PILES, FURNISHED | 0 | 155652 |
| 509E10000 - EPOXY COATED REINFORCING STEEL | 0 | 38415.02 |
| 509E10000 - EPOXY COATED REINFORCING STEEL | 0 | 94050.6 |
| 509E30040 - NO. 6 GFRP DEFORMED BARS | 0 | 940 |
| 509E30040 - NO. 6 GFRP DEFORMED BARS | 0 | 2300 |
| 511E33500 - SEMI-INTEGRAL DIAPHRAGM GUIDE | 0 | 1848.74 |
| 511E33500 - SEMI-INTEGRAL DIAPHRAGM GUIDE | 0 | 1848.74 |
| 511E34462 - CLASS QC SCC CONCRETE WITH QC/QA, BRIDGE DECK (PARAPET) | 0 | 23000 |
| 511E34462 - CLASS QC SCC CONCRETE WITH QC/QA, BRIDGE DECK (PARAPET) | 0 | 55000 |
| 511E43512 - CLASS QC1 CONCRETE WITH QC/QA, ABUTMENT INCLUDING FOOTING | 0 | 31014.97 |
| 511E43512 - CLASS QC1 CONCRETE WITH QC/QA, ABUTMENT INCLUDING FOOTING | 0 | 76050.4 |
| 511E53014 - CLASS QC3 CONCRETE, MISC.: | 0 | 111232 |
| 511E53014 - CLASS QC3 CONCRETE, MISC.: | 0 | 273152 |
| 512E10100 - SEALING OF CONCRETE SURFACES (EPOXY-URETHANE) | 0 | 4366.65 |
| 512E10100 - SEALING OF CONCRETE SURFACES (EPOXY-URETHANE) | 0 | 10706.94 |
| 512E10300 - SEALING CONCRETE BRIDGE DECKS WITH HMWM RESIN | 0 | 409.93 |
| 512E10300 - SEALING CONCRETE BRIDGE DECKS WITH HMWM RESIN | 0 | 979.29 |
| 512E33000 - TYPE 2 WATERPROOFING | 0 | 107.57 |
| 512E33000 - TYPE 2 WATERPROOFING | 0 | 322.72 |
| 515E15130 - DRAPED STRAND PRESTRESSED CONCRETE BRIDGE I-BEAM MEMBERS, LEVEL 3, TYPE WF72-49 | 0 | 94000 |
| 515E15130 - DRAPED STRAND PRESTRESSED CONCRETE BRIDGE I-BEAM MEMBERS, LEVEL 3, TYPE WF72-49 | 0 | 282000 |
| 515E20000 - INTERMEDIATE DIAPHRAGMS | 0 | 9542.76 |
| 515E20000 - INTERMEDIATE DIAPHRAGMS | 0 | 23856.91 |
| 516E13600 - 1" PREFORMED EXPANSION JOINT FILLER | 0 | 235.35 |
| 516E13600 - 1" PREFORMED EXPANSION JOINT FILLER | 0 | 580.87 |
| 516E13900 - 2" PREFORMED EXPANSION JOINT FILLER | 0 | 276.85 |
| 516E13900 - 2" PREFORMED EXPANSION JOINT FILLER | 0 | 692.12 |
| 516E14020 - SEMI-INTEGRAL ABUTMENT EXPANSION JOINT SEAL | 0 | 1848.58 |
| 516E14020 - SEMI-INTEGRAL ABUTMENT EXPANSION JOINT SEAL | 0 | 4511.8 |
| 516E44201 - ELASTOMERIC BEARING WITH INTERNAL LAMINATES AND LOAD PLATE (NEOPRENE), AS PER PLAN | 0 | 5000 |
| 516E44201 - ELASTOMERIC BEARING WITH INTERNAL LAMINATES AND LOAD PLATE (NEOPRENE), AS PER PLAN | 0 | 11000 |
| 518E21200 - POROUS BACKFILL WITH GEOTEXTILE FABRIC | 0 | 4104 |
| 518E21200 - POROUS BACKFILL WITH GEOTEXTILE FABRIC | 0 | 9936 |
| 518E40000 - 6" PERFORATED CORRUGATED PLASTIC PIPE | 0 | 730 |
| 518E40000 - 6" PERFORATED CORRUGATED PLASTIC PIPE | 0 | 1800 |
| 518E40012 - 6" NON-PERFORATED CORRUGATED PLASTIC PIPE | 0 | 241.2 |
| 518E40012 - 6" NON-PERFORATED CORRUGATED PLASTIC PIPE | 0 | 576.78 |
| 523E20000 - DYNAMIC LOAD TESTING | 0 | 2592.8 |
| 523E20000 - DYNAMIC LOAD TESTING | 0 | 7778.39 |
| 523E20500 - RESTRIKE | 0 | 1191.21 |
| 523E20500 - RESTRIKE | 0 | 3573.63 |
| 526E30000 - REINFORCED CONCRETE APPROACH SLABS (T=17") | 0 | 39204 |
| 526E30000 - REINFORCED CONCRETE APPROACH SLABS (T=17") | 0 | 95832 |
| 526E90010 - TYPE A INSTALLATION | 0 | 6350.57 |
| 526E90010 - TYPE A INSTALLATION | 0 | 15347.2 |
| 601E21050 - TIED CONCRETE BLOCK MAT, TYPE 1 | 0 | 192.13 |
| 601E21050 - TIED CONCRETE BLOCK MAT, TYPE 1 | 0 | 384.25 |
| 625E25604 - CONDUIT, 4", 725.051 | 0 | 1442.33 |
| 625E25604 - CONDUIT, 4", 725.051 | 0 | 3547.05 |
| 625E29921 - STRUCTURE JUNCTION BOX, AS PER PLAN | 0 | 1850 |
| 625E29921 - STRUCTURE JUNCTION BOX, AS PER PLAN | 0 | 1850 |
| 625E30700 - PULL BOX, 725.08, 18" | 0 | 769.99 |
| 625E30700 - PULL BOX, 725.08, 18" | 0 | 769.99 |
| 690E98400 - TEMPORARY SURCHARGE | 0 | 29000 |
| 690E98400 - TEMPORARY SURCHARGE | 0 | 71000 |
| 846E00110 - POLYMER MODIFIED ASPHALT EXPANSION JOINT SYSTEM | 0 | 3903.9 |
| 846E00110 - POLYMER MODIFIED ASPHALT EXPANSION JOINT SYSTEM | 0 | 9369.35 |
| 202E11003 - STRUCTURE REMOVED, OVER 20 FOOT SPAN, AS PER PLAN | 0 | 53747.15 |
| 202E11003 - STRUCTURE REMOVED, OVER 20 FOOT SPAN, AS PER PLAN | 0 | 131587.85 |
| 202E22900 - APPROACH SLAB REMOVED | 0 | 3408.58 |
| 202E22900 - APPROACH SLAB REMOVED | 0 | 8277.99 |
| 203E65000 - SETTLEMENT PLATFORM | 0 | 1319.2 |
| 203E65000 - SETTLEMENT PLATFORM | 0 | 3957.6 |
| 503E11101 - COFFERDAMS AND EXCAVATION BRACING, AS PER PLAN | 0 | 23200 |
| 503E11101 - COFFERDAMS AND EXCAVATION BRACING, AS PER PLAN | 0 | 56800 |
| 505E11100 - PILE DRIVING EQUIPMENT MOBILIZATION | 0 | 5800 |
| 505E11100 - PILE DRIVING EQUIPMENT MOBILIZATION | 0 | 14200 |
| 507E00600 - 14" CAST-IN-PLACE REINFORCED CONCRETE PILES, DRIVEN | 0 | 33925 |
| 507E00600 - 14" CAST-IN-PLACE REINFORCED CONCRETE PILES, DRIVEN | 0 | 83075 |
| 507E00650 - 14" CAST-IN-PLACE REINFORCED CONCRETE PILES, FURNISHED | 0 | 61404 |
| 507E00650 - 14" CAST-IN-PLACE REINFORCED CONCRETE PILES, FURNISHED | 0 | 150276 |
| 509E10000 - EPOXY COATED REINFORCING STEEL | 0 | 38424.82 |
| 509E10000 - EPOXY COATED REINFORCING STEEL | 0 | 94074.12 |
| 509E30040 - NO. 6 GFRP DEFORMED BARS | 0 | 940 |
| 509E30040 - NO. 6 GFRP DEFORMED BARS | 0 | 2300 |
| 511E33500 - SEMI-INTEGRAL DIAPHRAGM GUIDE | 0 | 1848.74 |
| 511E33500 - SEMI-INTEGRAL DIAPHRAGM GUIDE | 0 | 1848.74 |
| 511E34462 - CLASS QC SCC CONCRETE WITH QC/QA, BRIDGE DECK (PARAPET) | 0 | 23000 |
| 511E34462 - CLASS QC SCC CONCRETE WITH QC/QA, BRIDGE DECK (PARAPET) | 0 | 55000 |
| 511E43512 - CLASS QC1 CONCRETE WITH QC/QA, ABUTMENT INCLUDING FOOTING | 0 | 31014.97 |
| 511E43512 - CLASS QC1 CONCRETE WITH QC/QA, ABUTMENT INCLUDING FOOTING | 0 | 76050.4 |
| 511E53014 - CLASS QC3 CONCRETE, MISC.: | 0 | 111232 |
| 511E53014 - CLASS QC3 CONCRETE, MISC.: | 0 | 273152 |
| 512E10100 - SEALING OF CONCRETE SURFACES (EPOXY-URETHANE) | 0 | 4366.65 |
| 512E10100 - SEALING OF CONCRETE SURFACES (EPOXY-URETHANE) | 0 | 10706.94 |
| 512E10300 - SEALING CONCRETE BRIDGE DECKS WITH HMWM RESIN | 0 | 409.93 |
| 512E10300 - SEALING CONCRETE BRIDGE DECKS WITH HMWM RESIN | 0 | 979.29 |
| 512E33000 - TYPE 2 WATERPROOFING | 0 | 143.43 |
| 512E33000 - TYPE 2 WATERPROOFING | 0 | 322.72 |
| 515E15130 - DRAPED STRAND PRESTRESSED CONCRETE BRIDGE I-BEAM MEMBERS, LEVEL 3, TYPE WF72-49 | 0 | 111508.86 |
| 515E15130 - DRAPED STRAND PRESTRESSED CONCRETE BRIDGE I-BEAM MEMBERS, LEVEL 3, TYPE WF72-49 | 0 | 334526.59 |
| 515E20000 - INTERMEDIATE DIAPHRAGMS | 0 | 9542.76 |
| 515E20000 - INTERMEDIATE DIAPHRAGMS | 0 | 23856.91 |
| 516E13600 - 1" PREFORMED EXPANSION JOINT FILLER | 0 | 235.35 |
| 516E13600 - 1" PREFORMED EXPANSION JOINT FILLER | 0 | 580.87 |
| 516E13900 - 2" PREFORMED EXPANSION JOINT FILLER | 0 | 288.38 |
| 516E13900 - 2" PREFORMED EXPANSION JOINT FILLER | 0 | 692.12 |
| 516E14020 - SEMI-INTEGRAL ABUTMENT EXPANSION JOINT SEAL | 0 | 1848.58 |
| 516E14020 - SEMI-INTEGRAL ABUTMENT EXPANSION JOINT SEAL | 0 | 4511.8 |
| 516E44201 - ELASTOMERIC BEARING WITH INTERNAL LAMINATES AND LOAD PLATE (NEOPRENE), AS PER PLAN | 0 | 5000 |
| 516E44201 - ELASTOMERIC BEARING WITH INTERNAL LAMINATES AND LOAD PLATE (NEOPRENE), AS PER PLAN | 0 | 11000 |
| 518E21200 - POROUS BACKFILL WITH GEOTEXTILE FABRIC | 0 | 4104 |
| 518E21200 - POROUS BACKFILL WITH GEOTEXTILE FABRIC | 0 | 10044 |
| 518E40000 - 6" PERFORATED CORRUGATED PLASTIC PIPE | 0 | 730 |
| 518E40000 - 6" PERFORATED CORRUGATED PLASTIC PIPE | 0 | 1790 |
| 518E40012 - 6" NON-PERFORATED CORRUGATED PLASTIC PIPE | 0 | 157.3 |
| 518E40012 - 6" NON-PERFORATED CORRUGATED PLASTIC PIPE | 0 | 377.53 |
| 523E20000 - DYNAMIC LOAD TESTING | 0 | 2592.8 |
| 523E20000 - DYNAMIC LOAD TESTING | 0 | 7778.39 |
| 523E20500 - RESTRIKE | 0 | 1191.21 |
| 523E20500 - RESTRIKE | 0 | 3573.63 |
| 526E30000 - REINFORCED CONCRETE APPROACH SLABS (T=17") | 0 | 39204 |
| 526E30000 - REINFORCED CONCRETE APPROACH SLABS (T=17") | 0 | 95832 |
| 526E90010 - TYPE A INSTALLATION | 0 | 6350.57 |
| 526E90010 - TYPE A INSTALLATION | 0 | 15347.2 |
| 601E21050 - TIED CONCRETE BLOCK MAT, TYPE 1 | 0 | 192.13 |
| 601E21050 - TIED CONCRETE BLOCK MAT, TYPE 1 | 0 | 384.25 |
| 625E25604 - CONDUIT, 4", 725.051 | 0 | 1442.33 |
| 625E25604 - CONDUIT, 4", 725.051 | 0 | 3547.05 |
| 625E29921 - STRUCTURE JUNCTION BOX, AS PER PLAN | 0 | 1850 |
| 625E29921 - STRUCTURE JUNCTION BOX, AS PER PLAN | 0 | 1850 |
| 625E30700 - PULL BOX, 725.08, 18" | 0 | 769.99 |
| 625E30700 - PULL BOX, 725.08, 18" | 0 | 769.99 |
| 690E98400 - TEMPORARY SURCHARGE | 0 | 29000 |
| 690E98400 - TEMPORARY SURCHARGE | 0 | 71000 |
| 846E00110 - POLYMER MODIFIED ASPHALT EXPANSION JOINT SYSTEM | 0 | 3903.9 |
| 846E00110 - POLYMER MODIFIED ASPHALT EXPANSION JOINT SYSTEM | 0 | 9369.35 |
| 202E11200 - PORTIONS OF STRUCTURE REMOVED | 0 | 35000 |
| 202E35200 - PIPE REMOVED, OVER 24" | 0 | 1261.79 |
| 503E11100 - COFFERDAMS AND EXCAVATION BRACING | 0 | 5000 |
| 503E21300 - UNCLASSIFIED EXCAVATION | 0 | 17500 |
| 509E10000 - EPOXY COATED REINFORCING STEEL | 0 | 10341.94 |
| 511E46210 - CLASS QC1 CONCRETE, RETAINING/WINGWALL INCLUDING FOOTING | 0 | 65218.27 |
| 512E10100 - SEALING OF CONCRETE SURFACES (EPOXY-URETHANE) | 0 | 1480.22 |
| 518E21230 - POROUS BACKFILL WITH GEOTEXTILE FABRIC | 0 | 5000 |
| 601E11000 - RIPRAP, TYPE D | 0 | 10742.64 |
| 601E32104 - ROCK CHANNEL PROTECTION, TYPE B WITH GEOTEXTILE FABRIC | 0 | 10350.14 |
| 611E30000 - 96" CONDUIT, TYPE A | 0 | 33600 |
| 843E50001 - PATCHING CONCRETE STRUCTURES WITH TROWELABLE MORTAR, AS PER PLAN | 0 | 4000 |
| 202E30701 - CONCRETE BARRIER REMOVED, AS PER PLAN | 0 | 9800 |
| 509E10000 - EPOXY COATED REINFORCING STEEL | 0 | 360.64 |
| 510E10000 - DOWEL HOLES WITH NONSHRINK, NONMETALLIC GROUT | 0 | 320.17 |
| 511E53014 - CLASS QC3 CONCRETE, MISC.: | 0 | 4500 |
| 512E10100 - SEALING OF CONCRETE SURFACES (EPOXY-URETHANE) | 0 | 370.06 |
| 410E12000 - TRAFFIC COMPACTED SURFACE, TYPE A OR B | 0 | 6608.93 |
| 614E11110 - LAW ENFORCEMENT OFFICER WITH PATROL CAR FOR ASSISTANCE | 0 | 210155.64 |
| 614E11630 - INCREASED BARRIER DELINEATION | 0 | 10099.93 |
| 614E12380 - WORK ZONE IMPACT ATTENUATOR, 24" WIDE HAZARDS, (UNIDIRECTIONAL) | 0 | 80000 |
| 614E12484 - WORK ZONE INCREASED PENALTIES SIGN | 0 | 3998.17 |
| 614E12500 - REPLACEMENT SIGN | 0 | 2586.34 |
| 614E12600 - REPLACEMENT DRUM | 0 | 6100.47 |
| 614E12801 - WORK ZONE RAISED PAVEMENT MARKER, AS PER PLAN | 0 | 162500 |
| 614E13000 - ASPHALT CONCRETE FOR MAINTAINING TRAFFIC | 0 | 14630.74 |
| 614E13310 - BARRIER REFLECTOR, TYPE 1 | 0 | 89154 |
| 614E13312 - BARRIER REFLECTOR, TYPE 2 | 0 | 489.09 |
| 614E13350 - OBJECT MARKER, ONE WAY | 0 | 54494.88 |
| 614E18000 - MAINTAINING TRAFFIC, MISC.: | 0 | 35100 |
| 614E18002 - MAINTAINING TRAFFIC, MISC.: | 0 | 125000 |
| 614E18601 - PORTABLE CHANGEABLE MESSAGE SIGN, AS PER PLAN | 0 | 54000 |
| 614E20011 - WORK ZONE LANE LINE, CLASS I, 6", AS PER PLAN | 0 | 7362.5 |
| 614E20100 - WORK ZONE LANE LINE, CLASS I, 4", 642 PAINT | 0 | 2018.57 |
| 614E20110 - WORK ZONE LANE LINE, CLASS I, 6", 642 PAINT | 0 | 29194.1 |
| 614E20550 - WORK ZONE LANE LINE, CLASS III, 4", 642 PAINT | 0 | 468.85 |
| 614E20560 - WORK ZONE LANE LINE, CLASS III, 6", 642 PAINT | 0 | 10034.89 |
| 614E21100 - WORK ZONE CENTER LINE, CLASS I, 642 PAINT | 0 | 4418.92 |
| 614E21550 - WORK ZONE CENTER LINE, CLASS III, 642 PAINT | 0 | 1078.78 |
| 614E22011 - WORK ZONE EDGE LINE, CLASS I, 6", AS PER PLAN, | 0 | 36399 |
| 614E22100 - WORK ZONE EDGE LINE, CLASS I, 4", 642 PAINT | 0 | 2027.75 |
| 614E22110 - WORK ZONE EDGE LINE, CLASS I, 6", 642 PAINT | 0 | 85456.9 |
| 614E22350 - WORK ZONE EDGE LINE, CLASS III, 4", 642 PAINT | 0 | 103.75 |
| 614E22360 - WORK ZONE EDGE LINE, CLASS III, 6", 642 PAINT | 0 | 10005.69 |
| 614E23011 - WORK ZONE CHANNELIZING LINE, CLASS I, 12", AS PER PLAN | 0 | 72136.8 |
| 614E23200 - WORK ZONE CHANNELIZING LINE, CLASS I, 8", 642 PAINT | 0 | 8933.6 |
| 614E23210 - WORK ZONE CHANNELIZING LINE, CLASS I, 12", 642 PAINT | 0 | 173152.8 |
| 614E23680 - WORK ZONE CHANNELIZING LINE, CLASS III, 8", 642 PAINT | 0 | 3588.52 |
| 614E23690 - WORK ZONE CHANNELIZING LINE, CLASS III, 12", 642 PAINT | 0 | 9937.68 |
| 614E24001 - WORK ZONE DOTTED LINE, CLASS I, AS PER PLAN | 0 | 12832.02 |
| 614E24200 - WORK ZONE DOTTED LINE, CLASS I, 4", 642 PAINT | 0 | 2288.53 |
| 614E24202 - WORK ZONE DOTTED LINE, CLASS I, 6", 642 PAINT | 0 | 34258.9 |
| 614E24610 - WORK ZONE DOTTED LINE, CLASS III, 4", 642 PAINT | 0 | 493.97 |
| 614E24612 - WORK ZONE DOTTED LINE, CLASS III, 6", 642 PAINT | 0 | 7084.65 |
| 614E26200 - WORK ZONE STOP LINE, CLASS I, 642 PAINT | 0 | 3728.61 |
| 614E26610 - WORK ZONE STOP LINE, CLASS III, 642 PAINT | 0 | 1022.64 |
| 614E27200 - WORK ZONE CROSSWALK LINE, CLASS I, 642 PAINT | 0 | 2561.05 |
| 614E28200 - WORK ZONE GORE MARKING, CLASS II, 642 PAINT | 0 | 556 |
| 614E30200 - WORK ZONE ARROW, CLASS I, 642 PAINT | 0 | 16320 |
| 614E30650 - WORK ZONE ARROW, CLASS III, 642 PAINT | 0 | 3426.75 |
| 614E40051 - BUSINESS ENTRANCE SIGN, AS PER PLAN | 0 | 460 |
| 615E10000 - ROADS FOR MAINTAINING TRAFFIC | 0 | 50000 |
| 615E20001 - PAVEMENT FOR MAINTAINING TRAFFIC, CLASS A, AS PER PLAN | 0 | 1945700 |
| 616E10000 - WATER | 0 | 102000 |
| 622E41000 - PORTABLE BARRIER, 32" | 0 | 1066900 |
| 622E41020 - PORTABLE BARRIER, 32", BRIDGE MOUNTED | 0 | 33616 |
| 622E41050 - PORTABLE BARRIER, "Y" CONNECTOR | 0 | 5671.05 |
| 808E18700 - DIGITAL SPEED LIMIT (DSL) SIGN ASSEMBLY | 0 | 113400 |
| 103E05000 - PREMIUM FOR CONTRACT PERFORMANCE BOND AND FOR PAYMENT BOND | 0 | 200000 |
| 108E10000 - CPM PROGRESS SCHEDULE | 0 | 10000 |
| 614E11000 - MAINTAINING TRAFFIC | 0 | 1200000 |
| 619E16021 - FIELD OFFICE, TYPE C, AS PER PLAN | 0 | 52800 |
| 623E10000 - CONSTRUCTION LAYOUT STAKES AND SURVEYING | 0 | 200000 |
| 623E11000 - PROVIDING ELECTRONIC INSTRUMENTATION | 0 | 40000 |
| 624E10000 - MOBILIZATION | 0 | 800000 |